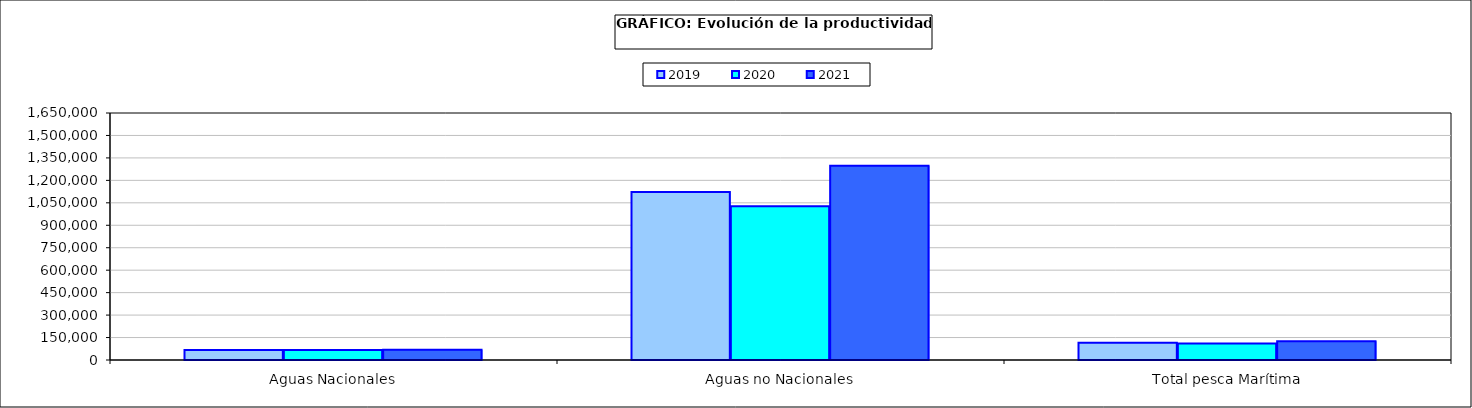
| Category | 2019 | 2020 | 2021 |
|---|---|---|---|
| 0 | 67190.989 | 66113.082 | 68427.362 |
| 1 | 1122087.946 | 1027429.335 | 1297468.667 |
| 2 | 114883.345 | 109697.976 | 124497.351 |